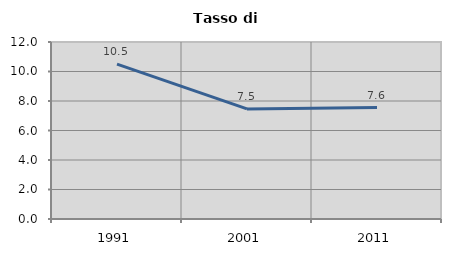
| Category | Tasso di disoccupazione   |
|---|---|
| 1991.0 | 10.504 |
| 2001.0 | 7.463 |
| 2011.0 | 7.554 |